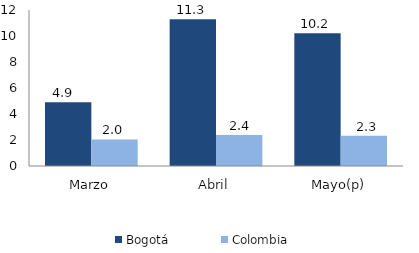
| Category | Bogotá | Colombia |
|---|---|---|
| Marzo | 4.905 | 2.047 |
| Abril | 11.29 | 2.377 |
| Mayo(p) | 10.213 | 2.331 |